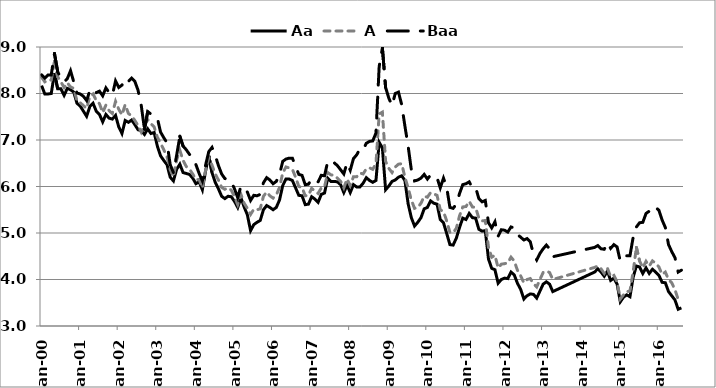
| Category | Aa | A | Baa |
|---|---|---|---|
| 2000-01-01 | 8.17 | 8.35 | 8.4 |
| 2000-02-01 | 7.99 | 8.25 | 8.33 |
| 2000-03-01 | 7.99 | 8.28 | 8.4 |
| 2000-04-01 | 8 | 8.29 | 8.4 |
| 2000-05-01 | 8.44 | 8.7 | 8.86 |
| 2000-06-01 | 8.1 | 8.36 | 8.47 |
| 2000-07-01 | 8.1 | 8.25 | 8.33 |
| 2000-08-01 | 7.96 | 8.13 | 8.25 |
| 2000-09-01 | 8.11 | 8.23 | 8.32 |
| 2000-10-01 | 8.08 | 8.14 | 8.49 |
| 2000-11-01 | 8.03 | 8.11 | 8.25 |
| 2000-12-01 | 7.79 | 7.84 | 8.01 |
| 2001-01-01 | 7.73 | 7.8 | 7.99 |
| 2001-02-01 | 7.62 | 7.74 | 7.94 |
| 2001-03-01 | 7.51 | 7.68 | 7.85 |
| 2001-04-01 | 7.72 | 7.94 | 8.06 |
| 2001-05-01 | 7.79 | 7.99 | 8.11 |
| 2001-06-01 | 7.62 | 7.85 | 8.02 |
| 2001-07-01 | 7.55 | 7.78 | 8.05 |
| 2001-08-01 | 7.39 | 7.59 | 7.95 |
| 2001-09-01 | 7.55 | 7.75 | 8.12 |
| 2001-10-01 | 7.47 | 7.63 | 8.02 |
| 2001-11-01 | 7.45 | 7.57 | 7.96 |
| 2001-12-01 | 7.53 | 7.83 | 8.27 |
| 2002-01-01 | 7.28 | 7.66 | 8.13 |
| 2002-02-01 | 7.14 | 7.54 | 8.18 |
| 2002-03-01 | 7.42 | 7.76 | 8.32 |
| 2002-04-01 | 7.38 | 7.57 | 8.26 |
| 2002-05-01 | 7.43 | 7.52 | 8.33 |
| 2002-06-01 | 7.33 | 7.42 | 8.26 |
| 2002-07-01 | 7.22 | 7.31 | 8.07 |
| 2002-08-01 | 7.2 | 7.17 | 7.74 |
| 2002-09-01 | 7.12 | 7.32 | 7.23 |
| 2002-10-01 | 7.24 | 7.44 | 7.61 |
| 2002-11-01 | 7.14 | 7.35 | 7.56 |
| 2002-12-01 | 7.16 | 7.28 | 7.52 |
| 2003-01-01 | 6.87 | 7.06 | 7.47 |
| 2003-02-01 | 6.66 | 6.93 | 7.17 |
| 2003-03-01 | 6.56 | 6.79 | 7.05 |
| 2003-04-01 | 6.47 | 6.64 | 6.94 |
| 2003-05-01 | 6.2 | 6.36 | 6.47 |
| 2003-06-01 | 6.12 | 6.21 | 6.3 |
| 2003-07-01 | 6.37 | 6.57 | 6.67 |
| 2003-08-01 | 6.48 | 6.78 | 7.08 |
| 2003-09-01 | 6.3 | 6.56 | 6.87 |
| 2003-10-01 | 6.28 | 6.43 | 6.79 |
| 2003-11-01 | 6.26 | 6.37 | 6.69 |
| 2003-12-01 | 6.18 | 6.27 | 6.61 |
| 2004-01-01 | 6.06 | 6.15 | 6.47 |
| 2004-02-01 | 6.1 | 6.15 | 6.28 |
| 2004-03-01 | 5.93 | 5.97 | 6.12 |
| 2004-04-01 | 6.33 | 6.35 | 6.46 |
| 2004-05-01 | 6.66 | 6.62 | 6.75 |
| 2004-06-01 | 6.3 | 6.46 | 6.84 |
| 2004-07-01 | 6.09 | 6.27 | 6.67 |
| 2004-08-01 | 5.95 | 6.14 | 6.45 |
| 2004-09-01 | 5.79 | 5.98 | 6.27 |
| 2004-10-01 | 5.74 | 5.94 | 6.17 |
| 2004-11-01 | 5.79 | 5.97 | 6.16 |
| 2004-12-01 | 5.78 | 5.92 | 6.1 |
| 2005-01-01 | 5.68 | 5.78 | 5.95 |
| 2005-02-01 | 5.55 | 5.61 | 5.76 |
| 2005-03-01 | 5.76 | 5.83 | 6.01 |
| 2005-04-01 | 5.56 | 5.64 | 5.95 |
| 2005-05-01 | 5.39 | 5.53 | 5.88 |
| 2005-06-01 | 5.05 | 5.4 | 5.7 |
| 2005-07-01 | 5.18 | 5.51 | 5.81 |
| 2005-08-01 | 5.23 | 5.5 | 5.8 |
| 2005-09-01 | 5.27 | 5.52 | 5.83 |
| 2005-10-01 | 5.5 | 5.79 | 6.08 |
| 2005-11-01 | 5.59 | 5.88 | 6.19 |
| 2005-12-01 | 5.55 | 5.8 | 6.14 |
| 2006-01-01 | 5.5 | 5.75 | 6.06 |
| 2006-02-01 | 5.55 | 5.82 | 6.11 |
| 2006-03-01 | 5.71 | 5.98 | 6.26 |
| 2006-04-01 | 6.02 | 6.29 | 6.54 |
| 2006-05-01 | 6.16 | 6.42 | 6.59 |
| 2006-06-01 | 6.16 | 6.4 | 6.61 |
| 2006-07-01 | 6.13 | 6.37 | 6.61 |
| 2006-08-01 | 5.97 | 6.2 | 6.43 |
| 2006-09-01 | 5.81 | 6 | 6.26 |
| 2006-10-01 | 5.8 | 5.98 | 6.24 |
| 2006-11-01 | 5.61 | 5.8 | 6.04 |
| 2006-12-01 | 5.62 | 5.81 | 6.05 |
| 2007-01-01 | 5.78 | 5.96 | 6.16 |
| 2007-02-01 | 5.73 | 5.9 | 6.1 |
| 2007-03-01 | 5.66 | 5.85 | 6.1 |
| 2007-04-01 | 5.83 | 5.97 | 6.24 |
| 2007-05-01 | 5.86 | 5.99 | 6.23 |
| 2007-06-01 | 6.18 | 6.3 | 6.54 |
| 2007-07-01 | 6.11 | 6.25 | 6.49 |
| 2007-08-01 | 6.11 | 6.24 | 6.51 |
| 2007-09-01 | 6.1 | 6.18 | 6.45 |
| 2007-10-01 | 6.04 | 6.11 | 6.36 |
| 2007-11-01 | 5.87 | 5.97 | 6.27 |
| 2007-12-01 | 6.03 | 6.16 | 6.51 |
| 2008-01-01 | 5.87 | 6.02 | 6.35 |
| 2008-02-01 | 6.04 | 6.21 | 6.6 |
| 2008-03-01 | 5.99 | 6.21 | 6.68 |
| 2008-04-01 | 5.99 | 6.29 | 6.81 |
| 2008-05-01 | 6.07 | 6.27 | 6.79 |
| 2008-06-01 | 6.19 | 6.38 | 6.93 |
| 2008-07-01 | 6.13 | 6.4 | 6.97 |
| 2008-08-01 | 6.09 | 6.37 | 6.98 |
| 2008-09-01 | 6.13 | 6.49 | 7.15 |
| 2008-10-01 | 6.95 | 7.56 | 8.58 |
| 2008-11-01 | 6.83 | 7.6 | 8.98 |
| 2008-12-01 | 5.93 | 6.54 | 8.13 |
| 2009-01-01 | 6.01 | 6.39 | 7.9 |
| 2009-02-01 | 6.11 | 6.3 | 7.74 |
| 2009-03-01 | 6.14 | 6.42 | 8 |
| 2009-04-01 | 6.2 | 6.48 | 8.03 |
| 2009-05-01 | 6.23 | 6.49 | 7.76 |
| 2009-06-01 | 6.13 | 6.2 | 7.3 |
| 2009-07-01 | 5.63 | 5.97 | 6.87 |
| 2009-08-01 | 5.33 | 5.71 | 6.36 |
| 2009-09-01 | 5.15 | 5.53 | 6.12 |
| 2009-10-01 | 5.23 | 5.55 | 6.14 |
| 2009-11-01 | 5.33 | 5.64 | 6.18 |
| 2009-12-01 | 5.52 | 5.79 | 6.26 |
| 2010-01-01 | 5.55 | 5.77 | 6.16 |
| 2010-02-01 | 5.69 | 5.87 | 6.25 |
| 2010-03-01 | 5.64 | 5.84 | 6.22 |
| 2010-04-01 | 5.62 | 5.81 | 6.19 |
| 2010-05-01 | 5.29 | 5.5 | 5.97 |
| 2010-06-01 | 5.22 | 5.46 | 6.18 |
| 2010-07-01 | 4.99 | 5.26 | 5.98 |
| 2010-08-01 | 4.75 | 5.01 | 5.55 |
| 2010-09-01 | 4.74 | 5.01 | 5.53 |
| 2010-10-01 | 4.89 | 5.1 | 5.62 |
| 2010-11-01 | 5.12 | 5.37 | 5.85 |
| 2010-12-01 | 5.32 | 5.56 | 6.04 |
| 2011-01-01 | 5.29 | 5.57 | 6.06 |
| 2011-02-01 | 5.42 | 5.68 | 6.1 |
| 2011-03-01 | 5.33 | 5.56 | 5.97 |
| 2011-04-01 | 5.32 | 5.55 | 5.98 |
| 2011-05-01 | 5.08 | 5.32 | 5.74 |
| 2011-06-01 | 5.04 | 5.26 | 5.67 |
| 2011-07-01 | 5.05 | 5.27 | 5.7 |
| 2011-08-01 | 4.44 | 4.69 | 5.22 |
| 2011-09-01 | 4.24 | 4.48 | 5.11 |
| 2011-10-01 | 4.21 | 4.52 | 5.24 |
| 2011-11-01 | 3.92 | 4.25 | 4.93 |
| 2011-12-01 | 4 | 4.33 | 5.07 |
| 2012-01-01 | 4.03 | 4.34 | 5.06 |
| 2012-02-01 | 4.02 | 4.36 | 5.02 |
| 2012-03-01 | 4.16 | 4.48 | 5.13 |
| 2012-04-01 | 4.1 | 4.4 | 5.11 |
| 2012-05-01 | 3.92 | 4.2 | 4.97 |
| 2012-06-01 | 3.79 | 4.08 | 4.91 |
| 2012-07-01 | 3.58 | 3.93 | 4.85 |
| 2012-08-01 | 3.65 | 4 | 4.88 |
| 2012-09-01 | 3.69 | 4.02 | 4.81 |
| 2012-10-01 | 3.68 | 3.91 | 4.54 |
| 2012-11-01 | 3.6 | 3.84 | 4.42 |
| 2012-12-01 | 3.75 | 4 | 4.56 |
| 2013-01-01 | 3.9 | 4.15 | 4.66 |
| 2013-02-01 | 3.95 | 4.18 | 4.74 |
| 2013-03-01 | 3.9 | 4.15 | 4.66 |
| 2013-04-01 | 3.74 | 4 | 4.49 |
| 2014-05-01 | 4.16 | 4.26 | 4.69 |
| 2014-06-01 | 4.23 | 4.29 | 4.73 |
| 2014-07-01 | 4.16 | 4.23 | 4.66 |
| 2014-08-01 | 4.07 | 4.13 | 4.65 |
| 2014-09-01 | 4.18 | 4.24 | 4.79 |
| 2014-10-01 | 3.98 | 4.06 | 4.67 |
| 2014-11-01 | 4.03 | 4.09 | 4.75 |
| 2014-12-01 | 3.9 | 3.95 | 4.7 |
| 2015-01-01 | 3.52 | 3.58 | 4.39 |
| 2015-02-01 | 3.62 | 3.67 | 4.44 |
| 2015-03-01 | 3.67 | 3.74 | 4.51 |
| 2015-04-01 | 3.63 | 3.75 | 4.51 |
| 2015-05-01 | 4.05 | 4.17 | 4.91 |
| 2015-06-01 | 4.29 | 4.69 | 5.13 |
| 2015-07-01 | 4.27 | 4.4 | 5.22 |
| 2015-08-01 | 4.13 | 4.25 | 5.23 |
| 2015-09-01 | 4.25 | 4.39 | 5.42 |
| 2015-10-01 | 4.13 | 4.29 | 5.47 |
| 2015-11-01 | 4.22 | 4.4 | 5.57 |
| 2015-12-01 | 4.16 | 4.35 | 5.55 |
| 2016-01-01 | 4.09 | 4.27 | 5.49 |
| 2016-02-01 | 3.94 | 4.11 | 5.28 |
| 2016-03-01 | 3.93 | 4.16 | 5.12 |
| 2016-04-01 | 3.74 | 4 | 4.75 |
| 2016-05-01 | 3.65 | 3.93 | 4.6 |
| 2016-06-01 | 3.56 | 3.78 | 4.47 |
| 2016-07-01 | 3.36 | 3.57 | 4.16 |
| 2016-08-01 | 3.39 | 3.59 | 4.2 |